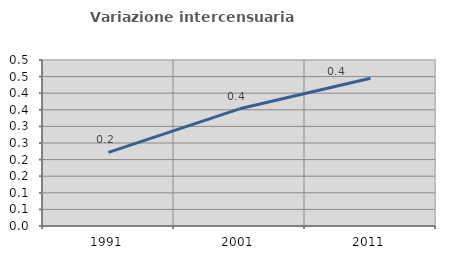
| Category | Variazione intercensuaria annua |
|---|---|
| 1991.0 | 0.222 |
| 2001.0 | 0.353 |
| 2011.0 | 0.445 |